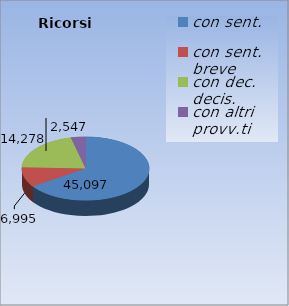
| Category | Ricorsi definiti |
|---|---|
| con sent. | 45097 |
| con sent. breve | 6995 |
| con dec. decis. | 14278 |
| con altri provv.ti | 2547 |